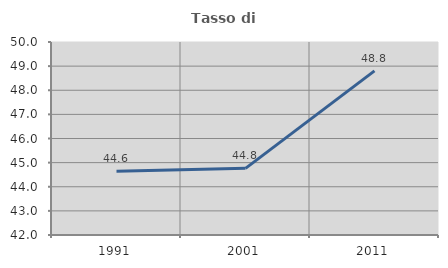
| Category | Tasso di occupazione   |
|---|---|
| 1991.0 | 44.643 |
| 2001.0 | 44.762 |
| 2011.0 | 48.805 |